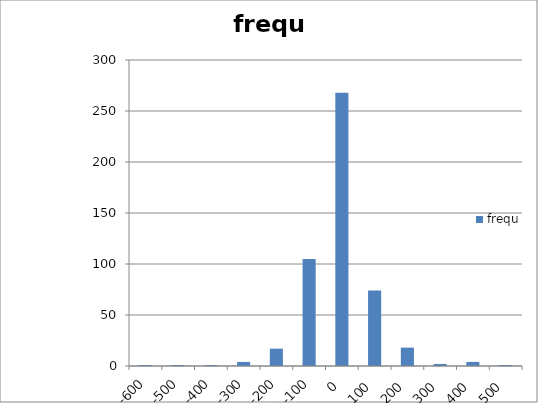
| Category | frequ |
|---|---|
| -600.0 | 1 |
| -500.0 | 1 |
| -400.0 | 1 |
| -300.0 | 4 |
| -200.0 | 17 |
| -100.0 | 105 |
| 0.0 | 268 |
| 100.0 | 74 |
| 200.0 | 18 |
| 300.0 | 2 |
| 400.0 | 4 |
| 500.0 | 1 |